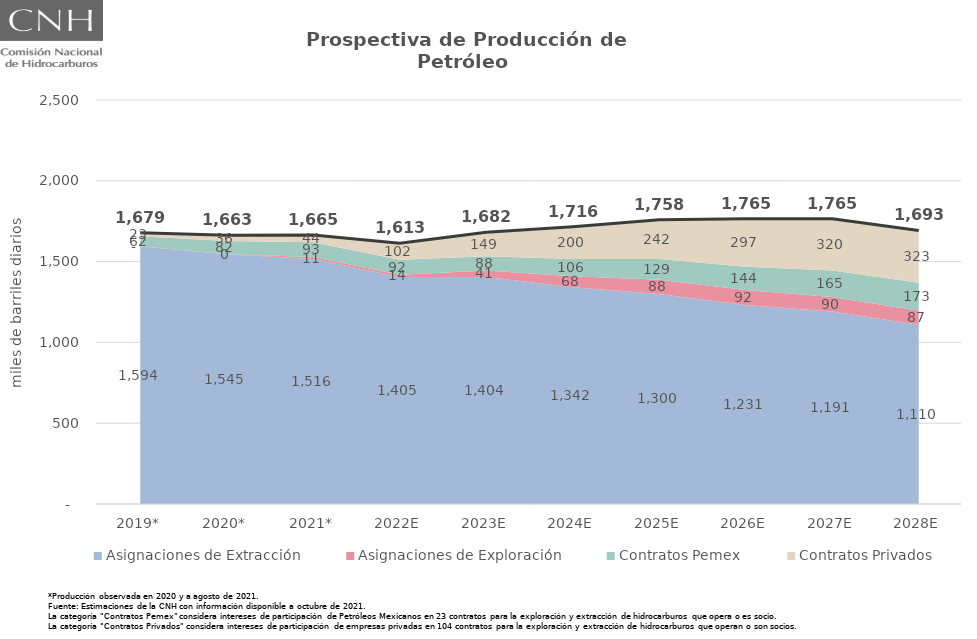
| Category | Total |
|---|---|
| 2019* | 1678.832 |
| 2020* | 1663.043 |
| 2021* | 1664.708 |
| 2022E | 1613.412 |
| 2023E | 1682.214 |
| 2024E | 1715.692 |
| 2025E | 1758.436 |
| 2026E | 1764.603 |
| 2027E | 1765.024 |
| 2028E | 1693.1 |